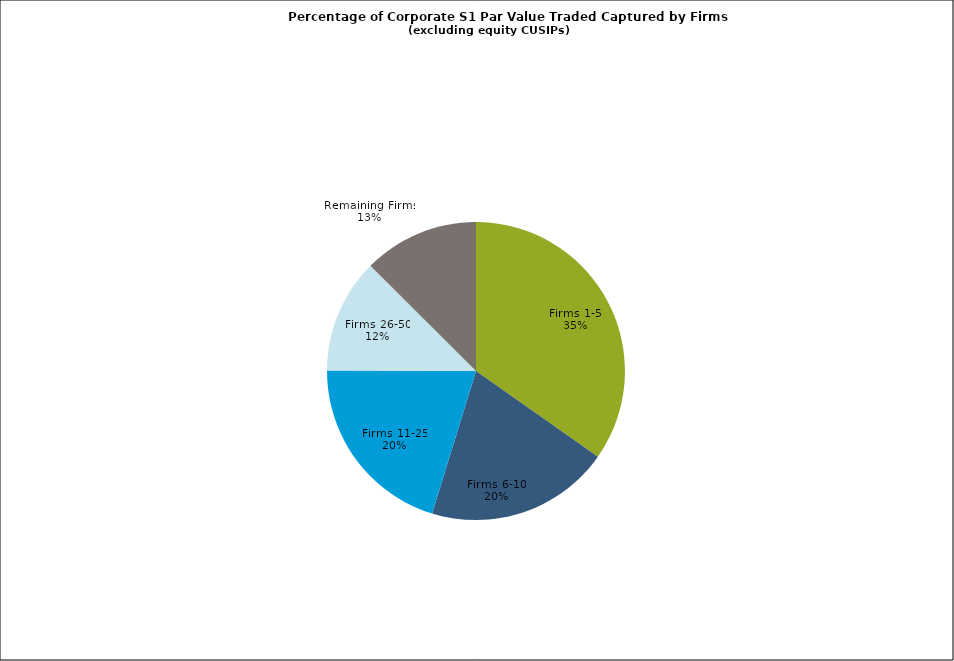
| Category | Series 0 |
|---|---|
| Firms 1-5 | 0.348 |
| Firms 6-10 | 0.2 |
| Firms 11-25 | 0.203 |
| Firms 26-50 | 0.124 |
| Remaining Firms | 0.125 |